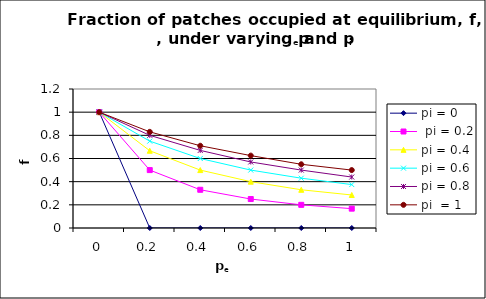
| Category | pi = 0 |  pi = 0.2 | pi = 0.4 | pi = 0.6 | pi = 0.8 | pi  = 1 |
|---|---|---|---|---|---|---|
| 0.0 | 1 | 1 | 1 | 1 | 1 | 1 |
| 0.2 | 0 | 0.5 | 0.667 | 0.75 | 0.8 | 0.83 |
| 0.4 | 0 | 0.33 | 0.5 | 0.6 | 0.67 | 0.71 |
| 0.6 | 0 | 0.25 | 0.4 | 0.5 | 0.57 | 0.625 |
| 0.8 | 0 | 0.2 | 0.33 | 0.43 | 0.5 | 0.55 |
| 1.0 | 0 | 0.167 | 0.285 | 0.375 | 0.44 | 0.5 |